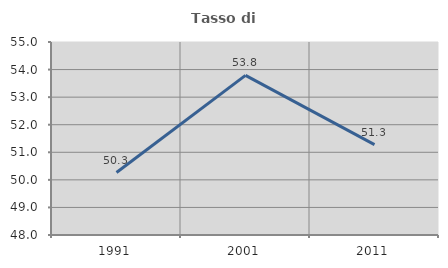
| Category | Tasso di occupazione   |
|---|---|
| 1991.0 | 50.266 |
| 2001.0 | 53.79 |
| 2011.0 | 51.279 |